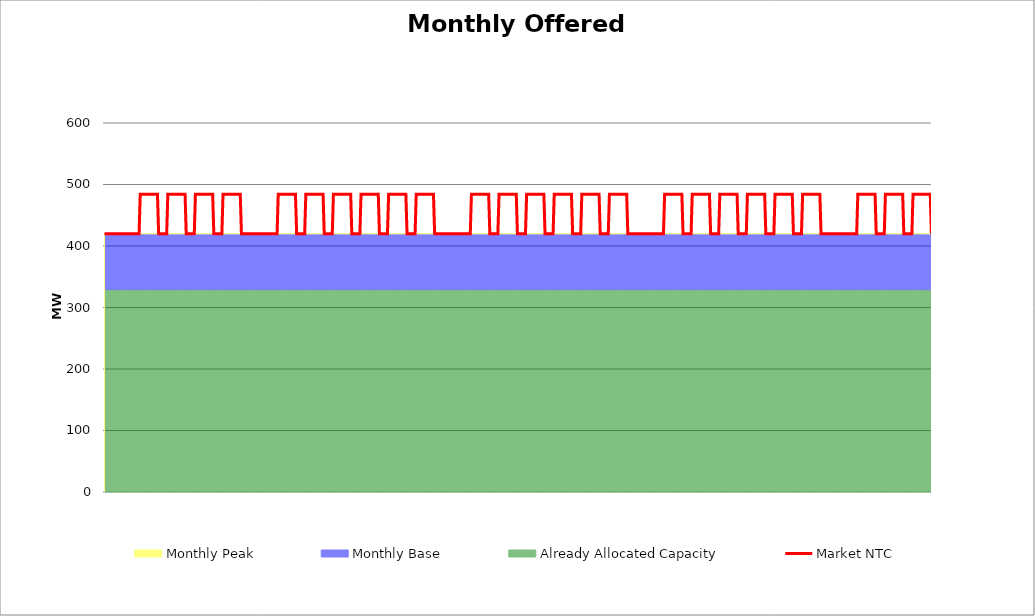
| Category | Market NTC |
|---|---|
| 0 | 420 |
| 1 | 420 |
| 2 | 420 |
| 3 | 420 |
| 4 | 420 |
| 5 | 420 |
| 6 | 420 |
| 7 | 420 |
| 8 | 420 |
| 9 | 420 |
| 10 | 420 |
| 11 | 420 |
| 12 | 420 |
| 13 | 420 |
| 14 | 420 |
| 15 | 420 |
| 16 | 420 |
| 17 | 420 |
| 18 | 420 |
| 19 | 420 |
| 20 | 420 |
| 21 | 420 |
| 22 | 420 |
| 23 | 420 |
| 24 | 420 |
| 25 | 420 |
| 26 | 420 |
| 27 | 420 |
| 28 | 420 |
| 29 | 420 |
| 30 | 420 |
| 31 | 484 |
| 32 | 484 |
| 33 | 484 |
| 34 | 484 |
| 35 | 484 |
| 36 | 484 |
| 37 | 484 |
| 38 | 484 |
| 39 | 484 |
| 40 | 484 |
| 41 | 484 |
| 42 | 484 |
| 43 | 484 |
| 44 | 484 |
| 45 | 484 |
| 46 | 484 |
| 47 | 420 |
| 48 | 420 |
| 49 | 420 |
| 50 | 420 |
| 51 | 420 |
| 52 | 420 |
| 53 | 420 |
| 54 | 420 |
| 55 | 484 |
| 56 | 484 |
| 57 | 484 |
| 58 | 484 |
| 59 | 484 |
| 60 | 484 |
| 61 | 484 |
| 62 | 484 |
| 63 | 484 |
| 64 | 484 |
| 65 | 484 |
| 66 | 484 |
| 67 | 484 |
| 68 | 484 |
| 69 | 484 |
| 70 | 484 |
| 71 | 420 |
| 72 | 420 |
| 73 | 420 |
| 74 | 420 |
| 75 | 420 |
| 76 | 420 |
| 77 | 420 |
| 78 | 420 |
| 79 | 484 |
| 80 | 484 |
| 81 | 484 |
| 82 | 484 |
| 83 | 484 |
| 84 | 484 |
| 85 | 484 |
| 86 | 484 |
| 87 | 484 |
| 88 | 484 |
| 89 | 484 |
| 90 | 484 |
| 91 | 484 |
| 92 | 484 |
| 93 | 484 |
| 94 | 484 |
| 95 | 420 |
| 96 | 420 |
| 97 | 420 |
| 98 | 420 |
| 99 | 420 |
| 100 | 420 |
| 101 | 420 |
| 102 | 420 |
| 103 | 484 |
| 104 | 484 |
| 105 | 484 |
| 106 | 484 |
| 107 | 484 |
| 108 | 484 |
| 109 | 484 |
| 110 | 484 |
| 111 | 484 |
| 112 | 484 |
| 113 | 484 |
| 114 | 484 |
| 115 | 484 |
| 116 | 484 |
| 117 | 484 |
| 118 | 484 |
| 119 | 420 |
| 120 | 420 |
| 121 | 420 |
| 122 | 420 |
| 123 | 420 |
| 124 | 420 |
| 125 | 420 |
| 126 | 420 |
| 127 | 420 |
| 128 | 420 |
| 129 | 420 |
| 130 | 420 |
| 131 | 420 |
| 132 | 420 |
| 133 | 420 |
| 134 | 420 |
| 135 | 420 |
| 136 | 420 |
| 137 | 420 |
| 138 | 420 |
| 139 | 420 |
| 140 | 420 |
| 141 | 420 |
| 142 | 420 |
| 143 | 420 |
| 144 | 420 |
| 145 | 420 |
| 146 | 420 |
| 147 | 420 |
| 148 | 420 |
| 149 | 420 |
| 150 | 420 |
| 151 | 484 |
| 152 | 484 |
| 153 | 484 |
| 154 | 484 |
| 155 | 484 |
| 156 | 484 |
| 157 | 484 |
| 158 | 484 |
| 159 | 484 |
| 160 | 484 |
| 161 | 484 |
| 162 | 484 |
| 163 | 484 |
| 164 | 484 |
| 165 | 484 |
| 166 | 484 |
| 167 | 420 |
| 168 | 420 |
| 169 | 420 |
| 170 | 420 |
| 171 | 420 |
| 172 | 420 |
| 173 | 420 |
| 174 | 420 |
| 175 | 484 |
| 176 | 484 |
| 177 | 484 |
| 178 | 484 |
| 179 | 484 |
| 180 | 484 |
| 181 | 484 |
| 182 | 484 |
| 183 | 484 |
| 184 | 484 |
| 185 | 484 |
| 186 | 484 |
| 187 | 484 |
| 188 | 484 |
| 189 | 484 |
| 190 | 484 |
| 191 | 420 |
| 192 | 420 |
| 193 | 420 |
| 194 | 420 |
| 195 | 420 |
| 196 | 420 |
| 197 | 420 |
| 198 | 420 |
| 199 | 484 |
| 200 | 484 |
| 201 | 484 |
| 202 | 484 |
| 203 | 484 |
| 204 | 484 |
| 205 | 484 |
| 206 | 484 |
| 207 | 484 |
| 208 | 484 |
| 209 | 484 |
| 210 | 484 |
| 211 | 484 |
| 212 | 484 |
| 213 | 484 |
| 214 | 484 |
| 215 | 420 |
| 216 | 420 |
| 217 | 420 |
| 218 | 420 |
| 219 | 420 |
| 220 | 420 |
| 221 | 420 |
| 222 | 420 |
| 223 | 484 |
| 224 | 484 |
| 225 | 484 |
| 226 | 484 |
| 227 | 484 |
| 228 | 484 |
| 229 | 484 |
| 230 | 484 |
| 231 | 484 |
| 232 | 484 |
| 233 | 484 |
| 234 | 484 |
| 235 | 484 |
| 236 | 484 |
| 237 | 484 |
| 238 | 484 |
| 239 | 420 |
| 240 | 420 |
| 241 | 420 |
| 242 | 420 |
| 243 | 420 |
| 244 | 420 |
| 245 | 420 |
| 246 | 420 |
| 247 | 484 |
| 248 | 484 |
| 249 | 484 |
| 250 | 484 |
| 251 | 484 |
| 252 | 484 |
| 253 | 484 |
| 254 | 484 |
| 255 | 484 |
| 256 | 484 |
| 257 | 484 |
| 258 | 484 |
| 259 | 484 |
| 260 | 484 |
| 261 | 484 |
| 262 | 484 |
| 263 | 420 |
| 264 | 420 |
| 265 | 420 |
| 266 | 420 |
| 267 | 420 |
| 268 | 420 |
| 269 | 420 |
| 270 | 420 |
| 271 | 484 |
| 272 | 484 |
| 273 | 484 |
| 274 | 484 |
| 275 | 484 |
| 276 | 484 |
| 277 | 484 |
| 278 | 484 |
| 279 | 484 |
| 280 | 484 |
| 281 | 484 |
| 282 | 484 |
| 283 | 484 |
| 284 | 484 |
| 285 | 484 |
| 286 | 484 |
| 287 | 420 |
| 288 | 420 |
| 289 | 420 |
| 290 | 420 |
| 291 | 420 |
| 292 | 420 |
| 293 | 420 |
| 294 | 420 |
| 295 | 420 |
| 296 | 420 |
| 297 | 420 |
| 298 | 420 |
| 299 | 420 |
| 300 | 420 |
| 301 | 420 |
| 302 | 420 |
| 303 | 420 |
| 304 | 420 |
| 305 | 420 |
| 306 | 420 |
| 307 | 420 |
| 308 | 420 |
| 309 | 420 |
| 310 | 420 |
| 311 | 420 |
| 312 | 420 |
| 313 | 420 |
| 314 | 420 |
| 315 | 420 |
| 316 | 420 |
| 317 | 420 |
| 318 | 420 |
| 319 | 484 |
| 320 | 484 |
| 321 | 484 |
| 322 | 484 |
| 323 | 484 |
| 324 | 484 |
| 325 | 484 |
| 326 | 484 |
| 327 | 484 |
| 328 | 484 |
| 329 | 484 |
| 330 | 484 |
| 331 | 484 |
| 332 | 484 |
| 333 | 484 |
| 334 | 484 |
| 335 | 420 |
| 336 | 420 |
| 337 | 420 |
| 338 | 420 |
| 339 | 420 |
| 340 | 420 |
| 341 | 420 |
| 342 | 420 |
| 343 | 484 |
| 344 | 484 |
| 345 | 484 |
| 346 | 484 |
| 347 | 484 |
| 348 | 484 |
| 349 | 484 |
| 350 | 484 |
| 351 | 484 |
| 352 | 484 |
| 353 | 484 |
| 354 | 484 |
| 355 | 484 |
| 356 | 484 |
| 357 | 484 |
| 358 | 484 |
| 359 | 420 |
| 360 | 420 |
| 361 | 420 |
| 362 | 420 |
| 363 | 420 |
| 364 | 420 |
| 365 | 420 |
| 366 | 420 |
| 367 | 484 |
| 368 | 484 |
| 369 | 484 |
| 370 | 484 |
| 371 | 484 |
| 372 | 484 |
| 373 | 484 |
| 374 | 484 |
| 375 | 484 |
| 376 | 484 |
| 377 | 484 |
| 378 | 484 |
| 379 | 484 |
| 380 | 484 |
| 381 | 484 |
| 382 | 484 |
| 383 | 420 |
| 384 | 420 |
| 385 | 420 |
| 386 | 420 |
| 387 | 420 |
| 388 | 420 |
| 389 | 420 |
| 390 | 420 |
| 391 | 484 |
| 392 | 484 |
| 393 | 484 |
| 394 | 484 |
| 395 | 484 |
| 396 | 484 |
| 397 | 484 |
| 398 | 484 |
| 399 | 484 |
| 400 | 484 |
| 401 | 484 |
| 402 | 484 |
| 403 | 484 |
| 404 | 484 |
| 405 | 484 |
| 406 | 484 |
| 407 | 420 |
| 408 | 420 |
| 409 | 420 |
| 410 | 420 |
| 411 | 420 |
| 412 | 420 |
| 413 | 420 |
| 414 | 420 |
| 415 | 484 |
| 416 | 484 |
| 417 | 484 |
| 418 | 484 |
| 419 | 484 |
| 420 | 484 |
| 421 | 484 |
| 422 | 484 |
| 423 | 484 |
| 424 | 484 |
| 425 | 484 |
| 426 | 484 |
| 427 | 484 |
| 428 | 484 |
| 429 | 484 |
| 430 | 484 |
| 431 | 420 |
| 432 | 420 |
| 433 | 420 |
| 434 | 420 |
| 435 | 420 |
| 436 | 420 |
| 437 | 420 |
| 438 | 420 |
| 439 | 484 |
| 440 | 484 |
| 441 | 484 |
| 442 | 484 |
| 443 | 484 |
| 444 | 484 |
| 445 | 484 |
| 446 | 484 |
| 447 | 484 |
| 448 | 484 |
| 449 | 484 |
| 450 | 484 |
| 451 | 484 |
| 452 | 484 |
| 453 | 484 |
| 454 | 484 |
| 455 | 420 |
| 456 | 420 |
| 457 | 420 |
| 458 | 420 |
| 459 | 420 |
| 460 | 420 |
| 461 | 420 |
| 462 | 420 |
| 463 | 420 |
| 464 | 420 |
| 465 | 420 |
| 466 | 420 |
| 467 | 420 |
| 468 | 420 |
| 469 | 420 |
| 470 | 420 |
| 471 | 420 |
| 472 | 420 |
| 473 | 420 |
| 474 | 420 |
| 475 | 420 |
| 476 | 420 |
| 477 | 420 |
| 478 | 420 |
| 479 | 420 |
| 480 | 420 |
| 481 | 420 |
| 482 | 420 |
| 483 | 420 |
| 484 | 420 |
| 485 | 420 |
| 486 | 420 |
| 487 | 484 |
| 488 | 484 |
| 489 | 484 |
| 490 | 484 |
| 491 | 484 |
| 492 | 484 |
| 493 | 484 |
| 494 | 484 |
| 495 | 484 |
| 496 | 484 |
| 497 | 484 |
| 498 | 484 |
| 499 | 484 |
| 500 | 484 |
| 501 | 484 |
| 502 | 484 |
| 503 | 420 |
| 504 | 420 |
| 505 | 420 |
| 506 | 420 |
| 507 | 420 |
| 508 | 420 |
| 509 | 420 |
| 510 | 420 |
| 511 | 484 |
| 512 | 484 |
| 513 | 484 |
| 514 | 484 |
| 515 | 484 |
| 516 | 484 |
| 517 | 484 |
| 518 | 484 |
| 519 | 484 |
| 520 | 484 |
| 521 | 484 |
| 522 | 484 |
| 523 | 484 |
| 524 | 484 |
| 525 | 484 |
| 526 | 484 |
| 527 | 420 |
| 528 | 420 |
| 529 | 420 |
| 530 | 420 |
| 531 | 420 |
| 532 | 420 |
| 533 | 420 |
| 534 | 420 |
| 535 | 484 |
| 536 | 484 |
| 537 | 484 |
| 538 | 484 |
| 539 | 484 |
| 540 | 484 |
| 541 | 484 |
| 542 | 484 |
| 543 | 484 |
| 544 | 484 |
| 545 | 484 |
| 546 | 484 |
| 547 | 484 |
| 548 | 484 |
| 549 | 484 |
| 550 | 484 |
| 551 | 420 |
| 552 | 420 |
| 553 | 420 |
| 554 | 420 |
| 555 | 420 |
| 556 | 420 |
| 557 | 420 |
| 558 | 420 |
| 559 | 484 |
| 560 | 484 |
| 561 | 484 |
| 562 | 484 |
| 563 | 484 |
| 564 | 484 |
| 565 | 484 |
| 566 | 484 |
| 567 | 484 |
| 568 | 484 |
| 569 | 484 |
| 570 | 484 |
| 571 | 484 |
| 572 | 484 |
| 573 | 484 |
| 574 | 484 |
| 575 | 420 |
| 576 | 420 |
| 577 | 420 |
| 578 | 420 |
| 579 | 420 |
| 580 | 420 |
| 581 | 420 |
| 582 | 420 |
| 583 | 484 |
| 584 | 484 |
| 585 | 484 |
| 586 | 484 |
| 587 | 484 |
| 588 | 484 |
| 589 | 484 |
| 590 | 484 |
| 591 | 484 |
| 592 | 484 |
| 593 | 484 |
| 594 | 484 |
| 595 | 484 |
| 596 | 484 |
| 597 | 484 |
| 598 | 484 |
| 599 | 420 |
| 600 | 420 |
| 601 | 420 |
| 602 | 420 |
| 603 | 420 |
| 604 | 420 |
| 605 | 420 |
| 606 | 420 |
| 607 | 484 |
| 608 | 484 |
| 609 | 484 |
| 610 | 484 |
| 611 | 484 |
| 612 | 484 |
| 613 | 484 |
| 614 | 484 |
| 615 | 484 |
| 616 | 484 |
| 617 | 484 |
| 618 | 484 |
| 619 | 484 |
| 620 | 484 |
| 621 | 484 |
| 622 | 484 |
| 623 | 420 |
| 624 | 420 |
| 625 | 420 |
| 626 | 420 |
| 627 | 420 |
| 628 | 420 |
| 629 | 420 |
| 630 | 420 |
| 631 | 420 |
| 632 | 420 |
| 633 | 420 |
| 634 | 420 |
| 635 | 420 |
| 636 | 420 |
| 637 | 420 |
| 638 | 420 |
| 639 | 420 |
| 640 | 420 |
| 641 | 420 |
| 642 | 420 |
| 643 | 420 |
| 644 | 420 |
| 645 | 420 |
| 646 | 420 |
| 647 | 420 |
| 648 | 420 |
| 649 | 420 |
| 650 | 420 |
| 651 | 420 |
| 652 | 420 |
| 653 | 420 |
| 654 | 420 |
| 655 | 484 |
| 656 | 484 |
| 657 | 484 |
| 658 | 484 |
| 659 | 484 |
| 660 | 484 |
| 661 | 484 |
| 662 | 484 |
| 663 | 484 |
| 664 | 484 |
| 665 | 484 |
| 666 | 484 |
| 667 | 484 |
| 668 | 484 |
| 669 | 484 |
| 670 | 484 |
| 671 | 420 |
| 672 | 420 |
| 673 | 420 |
| 674 | 420 |
| 675 | 420 |
| 676 | 420 |
| 677 | 420 |
| 678 | 420 |
| 679 | 484 |
| 680 | 484 |
| 681 | 484 |
| 682 | 484 |
| 683 | 484 |
| 684 | 484 |
| 685 | 484 |
| 686 | 484 |
| 687 | 484 |
| 688 | 484 |
| 689 | 484 |
| 690 | 484 |
| 691 | 484 |
| 692 | 484 |
| 693 | 484 |
| 694 | 484 |
| 695 | 420 |
| 696 | 420 |
| 697 | 420 |
| 698 | 420 |
| 699 | 420 |
| 700 | 420 |
| 701 | 420 |
| 702 | 420 |
| 703 | 484 |
| 704 | 484 |
| 705 | 484 |
| 706 | 484 |
| 707 | 484 |
| 708 | 484 |
| 709 | 484 |
| 710 | 484 |
| 711 | 484 |
| 712 | 484 |
| 713 | 484 |
| 714 | 484 |
| 715 | 484 |
| 716 | 484 |
| 717 | 484 |
| 718 | 484 |
| 719 | 420 |